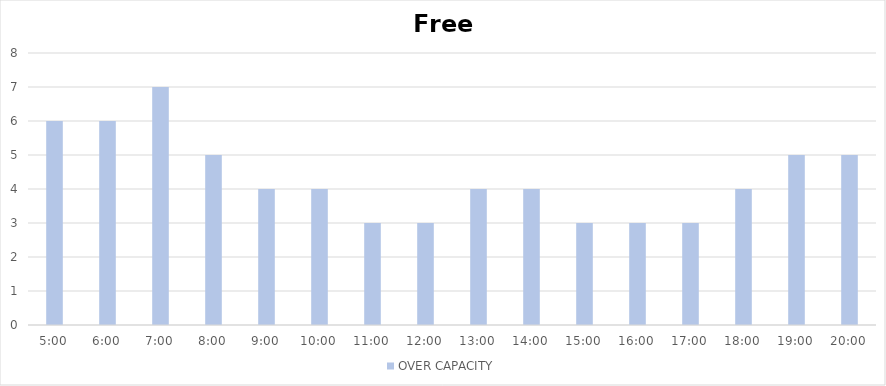
| Category | OVER CAPACITY |
|---|---|
| 0.20833333333333334 | 6 |
| 0.25 | 6 |
| 0.2916666666666667 | 7 |
| 0.3333333333333333 | 5 |
| 0.375 | 4 |
| 0.4166666666666667 | 4 |
| 0.4583333333333333 | 3 |
| 0.5 | 3 |
| 0.5416666666666666 | 4 |
| 0.5833333333333334 | 4 |
| 0.625 | 3 |
| 0.6666666666666666 | 3 |
| 0.7083333333333334 | 3 |
| 0.75 | 4 |
| 0.7916666666666666 | 5 |
| 0.8333333333333334 | 5 |